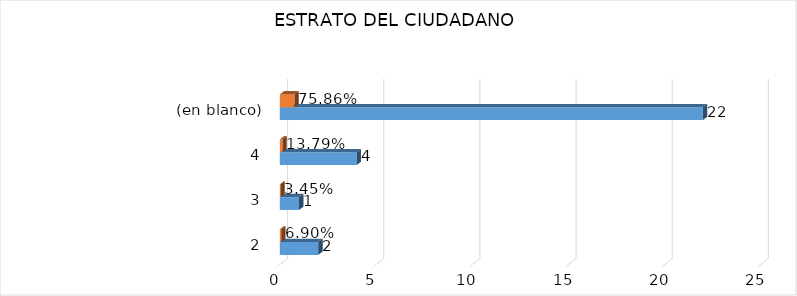
| Category | Cuenta de Número petición | Cuenta de Número petición2 |
|---|---|---|
| 2 | 2 | 0.069 |
| 3 | 1 | 0.034 |
| 4 | 4 | 0.138 |
| (en blanco) | 22 | 0.759 |